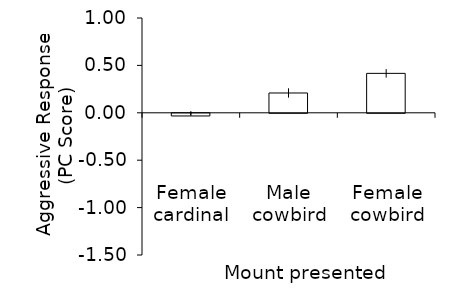
| Category | Aggressive response * |
|---|---|
| Female cardinal | -0.028 |
| Male cowbird | 0.209 |
| Female cowbird | 0.416 |